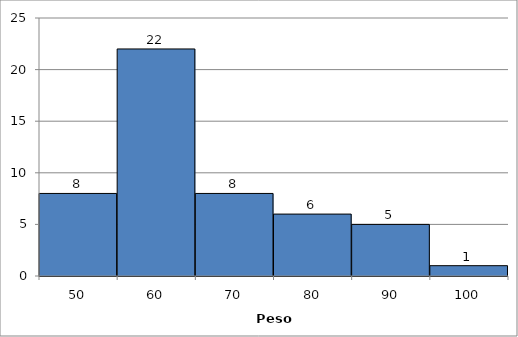
| Category | Series 0 |
|---|---|
| 50.0 | 8 |
| 60.0 | 22 |
| 70.0 | 8 |
| 80.0 | 6 |
| 90.0 | 5 |
| 100.0 | 1 |